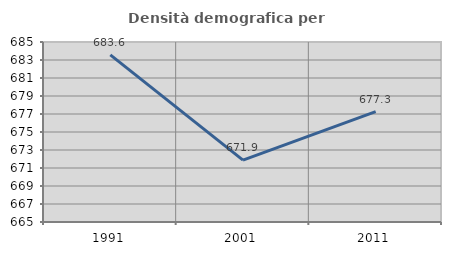
| Category | Densità demografica |
|---|---|
| 1991.0 | 683.571 |
| 2001.0 | 671.877 |
| 2011.0 | 677.26 |